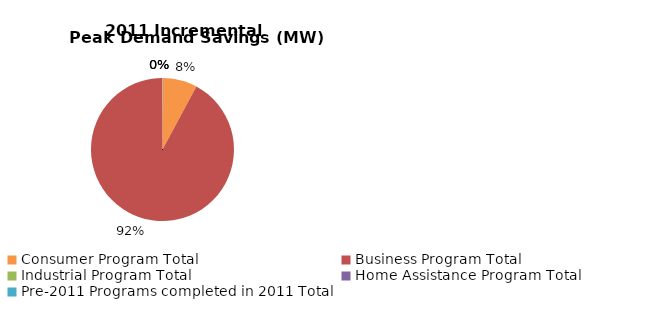
| Category | Incremental Peak Demand Savings (kW) |
|---|---|
| Consumer Program Total | 7.94 |
| Business Program Total | 93.015 |
| Industrial Program Total | 0 |
| Home Assistance Program Total | 0 |
| Pre-2011 Programs completed in 2011 Total | 0.066 |